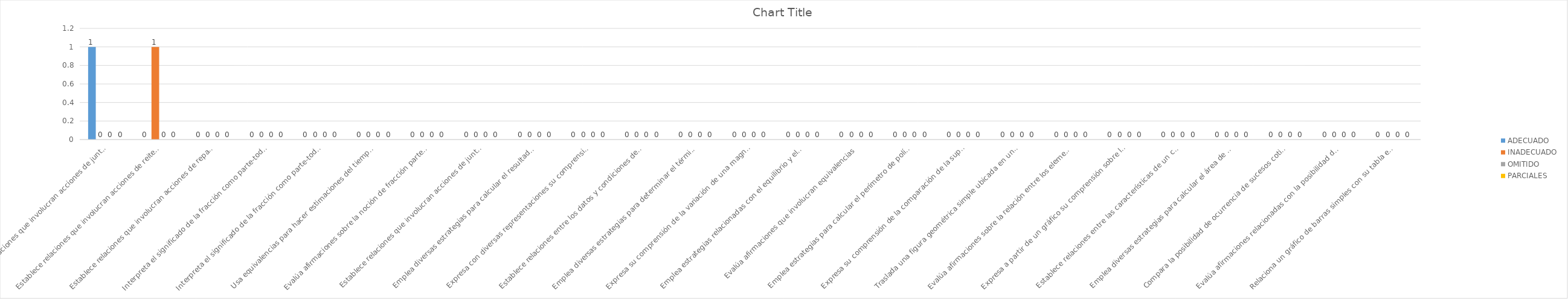
| Category | ADECUADO | INADECUADO | OMITIDO | PARCIALES |
|---|---|---|---|---|
| Establece relaciones que involucran acciones de juntar y quitar en situaciones aditivas con números naturales de hasta cuatro cifras. | 1 | 0 | 0 | 0 |
| Establece relaciones que involucran acciones de reiterar cantidades en situaciones multiplicativas con números naturales de hasta cuatro cifras. | 0 | 1 | 0 | 0 |
| Establece relaciones que involucran acciones de repartir cantidades en situaciones multiplicativas, interpretando el residuo, con números naturales de hasta cuatro cifras | 0 | 0 | 0 | 0 |
| Interpreta el significado de la fracción como parte-todo en cantidades continuas al pasar de una representación gráfica a una simbólica. | 0 | 0 | 0 | 0 |
| Interpreta el significado de la fracción como parte-todo en cantidades discretas al pasar de una representación gráfica a una simbólica | 0 | 0 | 0 | 0 |
| Usa equivalencias para hacer estimaciones del tiempo en horas y minutos. | 0 | 0 | 0 | 0 |
| Evalúa afirmaciones sobre la noción de fracción parte-todo. | 0 | 0 | 0 | 0 |
| Establece relaciones que involucran acciones de juntar en situaciones aditivas con fracciones usuales. | 0 | 0 | 0 | 0 |
| Emplea diversas estrategias para calcular el resultado de operaciones combinadas de adición y multiplicación con números naturales. | 0 | 0 | 0 | 0 |
| Expresa con diversas representaciones su comprensión del sentido de canje de dos equivalencias dadas. | 0 | 0 | 0 | 0 |
| Establece relaciones entre los datos y condiciones de una equivalencia y las transforma en igualdades multiplicativas. | 0 | 0 | 0 | 0 |
| Emplea diversas estrategias para determinar el término desconocido de un patrón de repetición con criterios geométricos. | 0 | 0 | 0 | 0 |
| Expresa su comprensión de la variación de una magnitud respecto a otra como un cambio constante. | 0 | 0 | 0 | 0 |
| Emplea estrategias relacionadas con el equilibrio y el canje para establecer nuevas equivalencias. | 0 | 0 | 0 | 0 |
| Evalúa afirmaciones que involucran equivalencias | 0 | 0 | 0 | 0 |
| Emplea estrategias para calcular el perímetro de polígonos en metros. | 0 | 0 | 0 | 0 |
| Expresa su comprensión de la comparación de la superficie de polígonos a partir de medidas no convencionales. | 0 | 0 | 0 | 0 |
| Traslada una figura geométrica simple ubicada en un plano, a partir de la descripción de su desplazamiento. | 0 | 0 | 0 | 0 |
| Evalúa afirmaciones sobre la relación entre los elementos de un prisma de base cuadrada con su desarrollo en el plano | 0 | 0 | 0 | 0 |
| Expresa a partir de un gráfico su comprensión sobre la capacidad al indicar cuántas veces un recipiente entra en otro. | 0 | 0 | 0 | 0 |
| Establece relaciones entre las características de un cuadrado que involucran el cálculo del perímetro a partir de medidas convencionales. | 0 | 0 | 0 | 0 |
| Emplea diversas estrategias para calcular el área de una figura bidimensional con unidades no convencionales. | 0 | 0 | 0 | 0 |
| Compara la posibilidad de ocurrencia de sucesos cotidianos usando la noción "más probable". | 0 | 0 | 0 | 0 |
| Evalúa afirmaciones relacionadas con la posibilidad de ocurrencia de sucesos. | 0 | 0 | 0 | 0 |
| Relaciona un gráfico de barras simples con su tabla estadística | 0 | 0 | 0 | 0 |